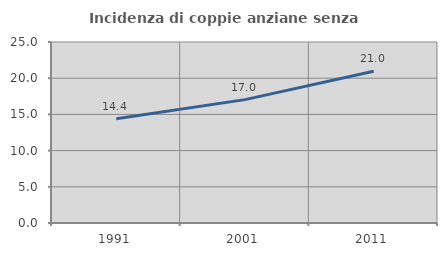
| Category | Incidenza di coppie anziane senza figli  |
|---|---|
| 1991.0 | 14.412 |
| 2001.0 | 17.042 |
| 2011.0 | 20.956 |